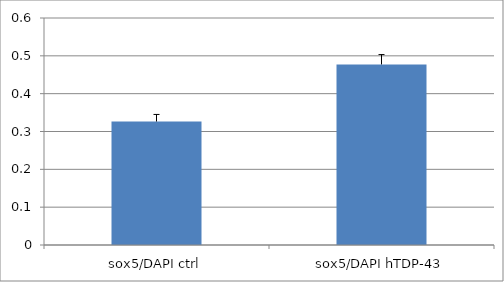
| Category | Series 0 |
|---|---|
| sox5/DAPI ctrl | 0.326 |
| sox5/DAPI hTDP-43 | 0.477 |